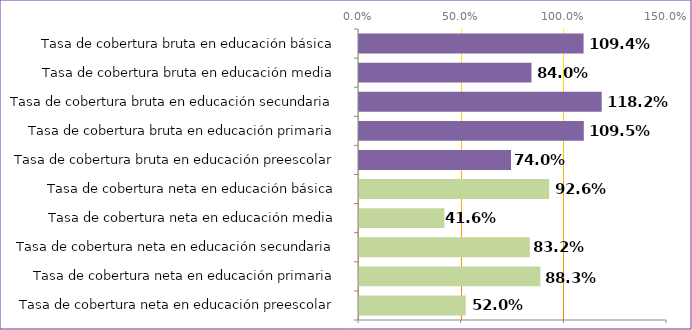
| Category | Series 0 |
|---|---|
| Tasa de cobertura neta en educación preescolar | 0.52 |
| Tasa de cobertura neta en educación primaria | 0.883 |
| Tasa de cobertura neta en educación secundaria | 0.832 |
| Tasa de cobertura neta en educación media | 0.416 |
| Tasa de cobertura neta en educación básica | 0.926 |
| Tasa de cobertura bruta en educación preescolar | 0.74 |
| Tasa de cobertura bruta en educación primaria | 1.095 |
| Tasa de cobertura bruta en educación secundaria | 1.182 |
| Tasa de cobertura bruta en educación media | 0.84 |
| Tasa de cobertura bruta en educación básica | 1.094 |